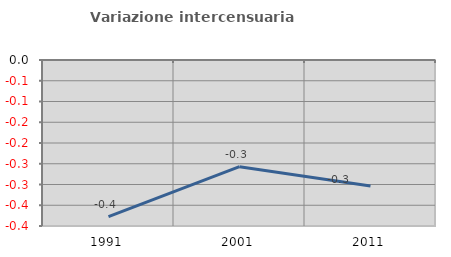
| Category | Variazione intercensuaria annua |
|---|---|
| 1991.0 | -0.377 |
| 2001.0 | -0.257 |
| 2011.0 | -0.304 |